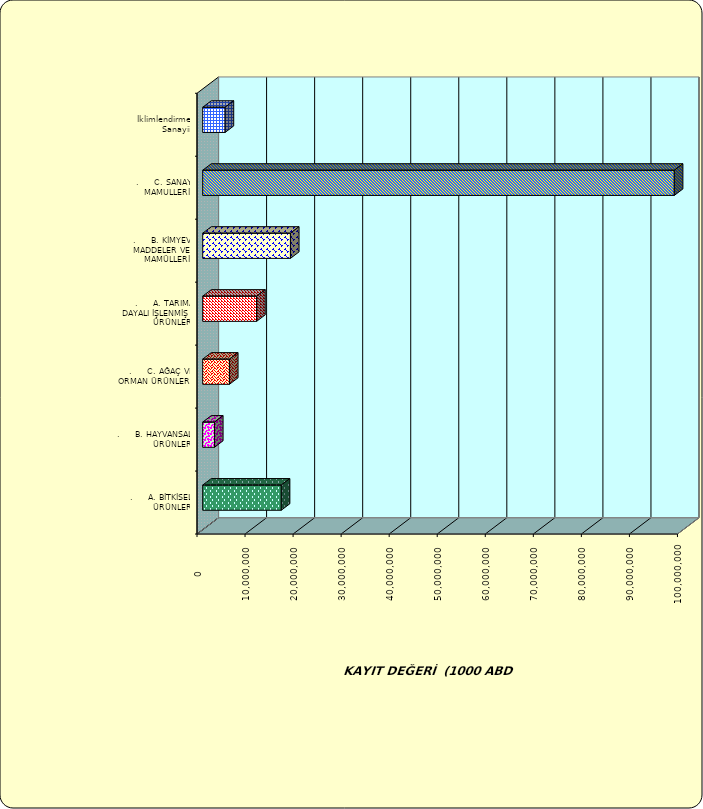
| Category | Series 0 |
|---|---|
| .     A. BİTKİSEL ÜRÜNLER | 16350706.306 |
| .     B. HAYVANSAL ÜRÜNLER | 2451931.069 |
| .     C. AĞAÇ VE ORMAN ÜRÜNLERİ | 5566505.484 |
| .     A. TARIMA DAYALI İŞLENMİŞ ÜRÜNLER | 11224483.602 |
| .     B. KİMYEVİ MADDELER VE MAMÜLLERİ | 18263488.437 |
| .     C. SANAYİ MAMULLERİ | 98157257.551 |
|  İklimlendirme Sanayii | 4664483.41 |